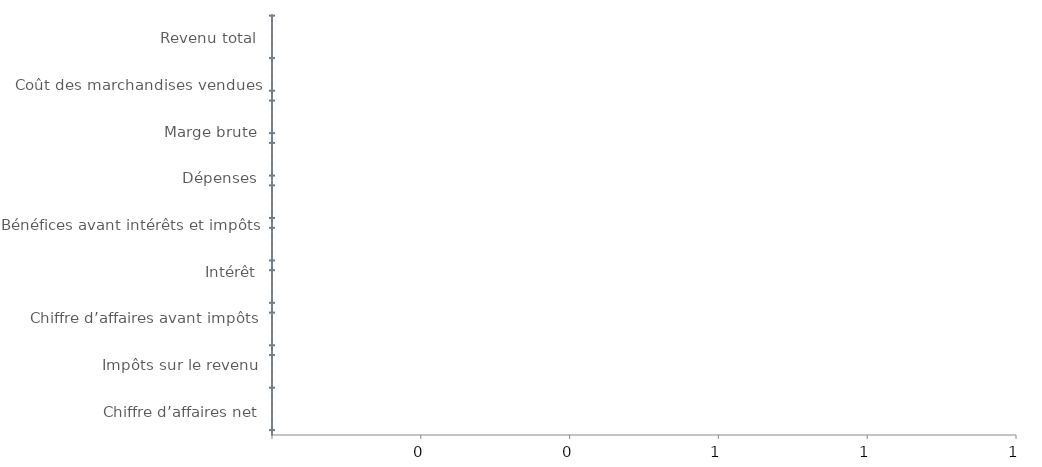
| Category | Se termine le | Vide | NegLoss | NegGain | PosLoss | PosGain |
|---|---|---|---|---|---|---|
| Revenu total | 0 | 0 | 0 | 0 | 0 | 0 |
| Coût des marchandises vendues | 0 | 0 | 0 | 0 | 0 | 0 |
| Marge brute | 0 | 0 | 0 | 0 | 0 | 0 |
| Dépenses | 0 | 0 | 0 | 0 | 0 | 0 |
| Bénéfices avant intérêts et impôts | 0 | 0 | 0 | 0 | 0 | 0 |
| Intérêt | 0 | 0 | 0 | 0 | 0 | 0 |
| Chiffre d’affaires avant impôts | 0 | 0 | 0 | 0 | 0 | 0 |
| Impôts sur le revenu | 0 | 0 | 0 | 0 | 0 | 0 |
| Chiffre d’affaires net | 0 | 0 | 0 | 0 | 0 | 0 |